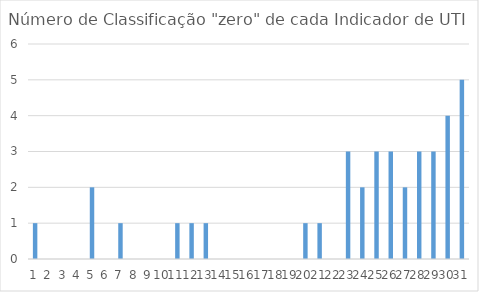
| Category | Series 0 |
|---|---|
| 0 | 1 |
| 1 | 0 |
| 2 | 0 |
| 3 | 0 |
| 4 | 2 |
| 5 | 0 |
| 6 | 1 |
| 7 | 0 |
| 8 | 0 |
| 9 | 0 |
| 10 | 1 |
| 11 | 1 |
| 12 | 1 |
| 13 | 0 |
| 14 | 0 |
| 15 | 0 |
| 16 | 0 |
| 17 | 0 |
| 18 | 0 |
| 19 | 1 |
| 20 | 1 |
| 21 | 0 |
| 22 | 3 |
| 23 | 2 |
| 24 | 3 |
| 25 | 3 |
| 26 | 2 |
| 27 | 3 |
| 28 | 3 |
| 29 | 4 |
| 30 | 5 |